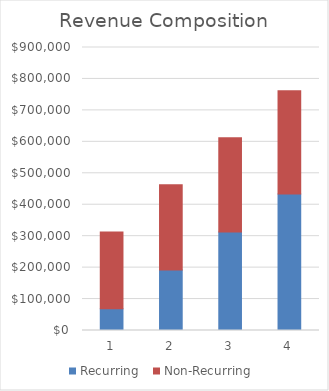
| Category | Recurring | Non-Recurring |
|---|---|---|
| 1.0 | 68900 | 244375 |
| 2.0 | 192655 | 271031.25 |
| 3.0 | 313495 | 299687.5 |
| 4.0 | 434335 | 328187.5 |